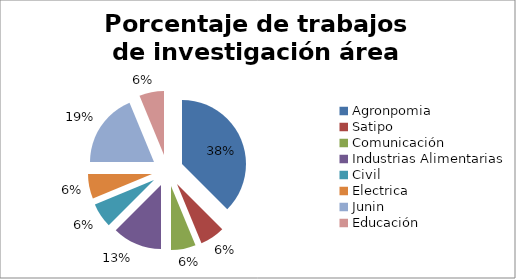
| Category | Nº |
|---|---|
| Agronpomia | 6 |
| Satipo | 1 |
| Comunicación | 1 |
| Industrias Alimentarias | 2 |
| Civil | 1 |
| Electrica | 1 |
| Junin | 3 |
| Educación | 1 |